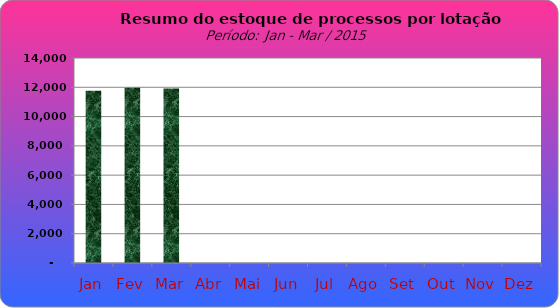
| Category | Series 0 |
|---|---|
| Jan | 11768 |
| Fev | 11973 |
| Mar | 11918 |
| Abr | 0 |
| Mai | 0 |
| Jun | 0 |
| Jul | 0 |
| Ago | 0 |
| Set | 0 |
| Out | 0 |
| Nov | 0 |
| Dez | 0 |